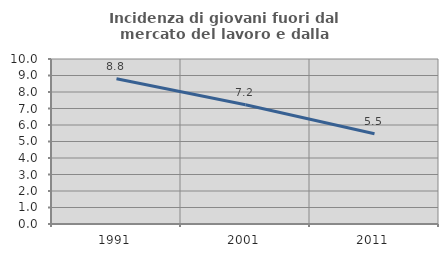
| Category | Incidenza di giovani fuori dal mercato del lavoro e dalla formazione  |
|---|---|
| 1991.0 | 8.805 |
| 2001.0 | 7.229 |
| 2011.0 | 5.466 |